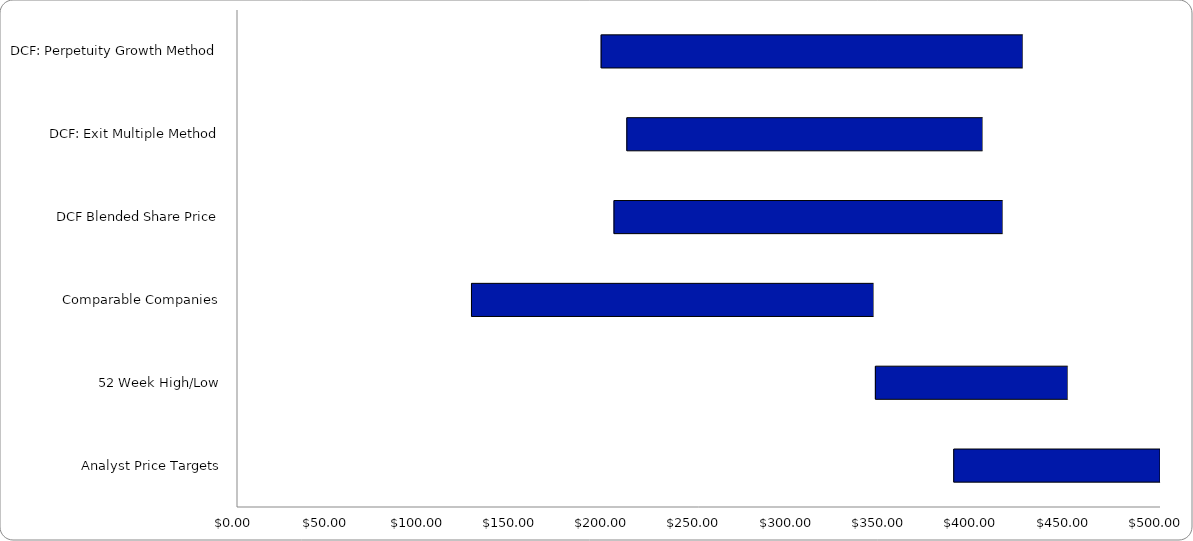
| Category | Low | Spread | High |
|---|---|---|---|
| DCF: Perpetuity Growth Method | 196.991 | 228.666 | 425.658 |
| DCF: Exit Multiple Method | 210.911 | 192.958 | 403.869 |
| DCF Blended Share Price | 203.951 | 210.812 | 414.763 |
| Comparable Companies | 126.749 | 218.073 | 344.823 |
| 52 Week High/Low | 345.55 | 104.45 | 450 |
| Analyst Price Targets | 388 | 122 | 510 |